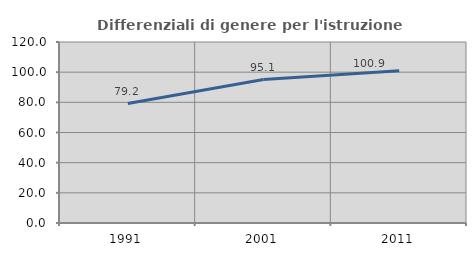
| Category | Differenziali di genere per l'istruzione superiore |
|---|---|
| 1991.0 | 79.164 |
| 2001.0 | 95.115 |
| 2011.0 | 100.916 |